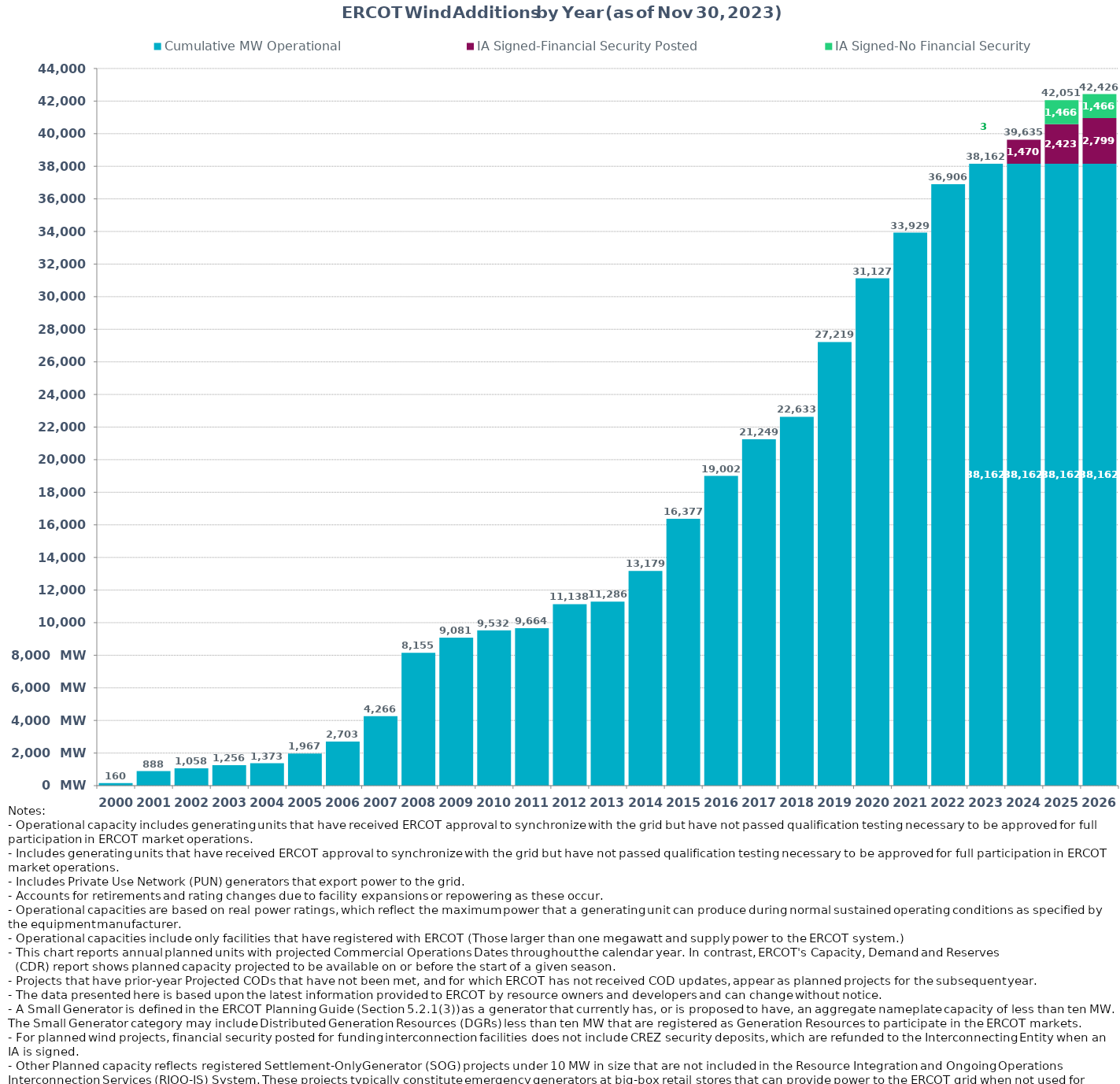
| Category | Cumulative MW Operational | IA Signed-Financial Security Posted  | IA Signed-No Financial Security  | Other Planned | Cumulative Installed and Planned |
|---|---|---|---|---|---|
| 2000.0 | 160.37 | 0 | 0 | 0 | 160.37 |
| 2001.0 | 887.97 | 0 | 0 | 0 | 887.97 |
| 2002.0 | 1058.22 | 0 | 0 | 0 | 1058.22 |
| 2003.0 | 1255.72 | 0 | 0 | 0 | 1255.72 |
| 2004.0 | 1372.82 | 0 | 0 | 0 | 1372.82 |
| 2005.0 | 1967.04 | 0 | 0 | 0 | 1967.04 |
| 2006.0 | 2703.34 | 0 | 0 | 0 | 2703.34 |
| 2007.0 | 4266.36 | 0 | 0 | 0 | 4266.36 |
| 2008.0 | 8154.76 | 0 | 0 | 0 | 8154.76 |
| 2009.0 | 9080.78 | 0 | 0 | 0 | 9080.78 |
| 2010.0 | 9531.7 | 0 | 0 | 0 | 9531.7 |
| 2011.0 | 9663.7 | 0 | 0 | 0 | 9663.7 |
| 2012.0 | 11137.66 | 0 | 0 | 0 | 11137.66 |
| 2013.0 | 11286.26 | 0 | 0 | 0 | 11286.26 |
| 2014.0 | 13178.84 | 0 | 0 | 0 | 13178.84 |
| 2015.0 | 16376.53 | 0 | 0 | 0 | 16376.53 |
| 2016.0 | 19001.85 | 0 | 0 | 0 | 19001.85 |
| 2017.0 | 21248.99 | 0 | 0 | 0 | 21248.99 |
| 2018.0 | 22632.69 | 0 | 0 | 0 | 22632.69 |
| 2019.0 | 27219.34 | 0 | 0 | 0 | 27219.34 |
| 2020.0 | 31127.31 | 0 | 0 | 0 | 31127.31 |
| 2021.0 | 33928.91 | 0 | 0 | 0 | 33928.91 |
| 2022.0 | 36906.07 | 0 | 0 | 0 | 36906.07 |
| 2023.0 | 38161.67 | 0 | 0 | 0 | 38161.67 |
| 2024.0 | 38161.67 | 1470.11 | 3 | 0 | 39634.78 |
| 2025.0 | 38161.67 | 2423.49 | 1466.2 | 0 | 42051.36 |
| 2026.0 | 38161.67 | 2798.55 | 1466.2 | 0 | 42426.42 |